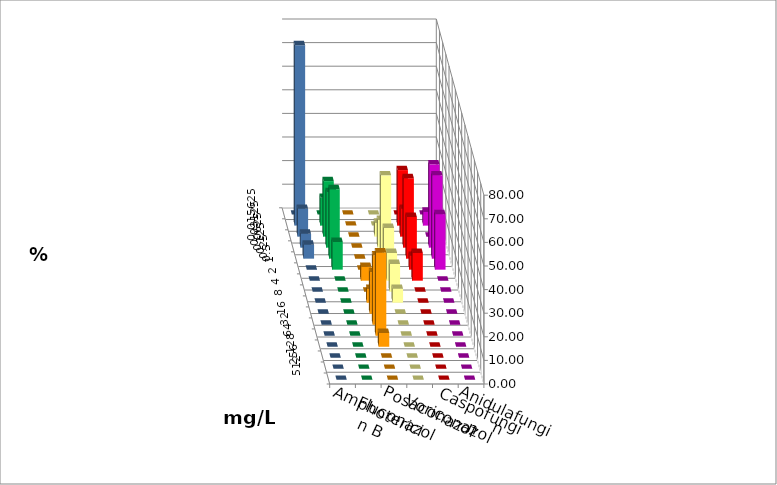
| Category | Amphotericin B | Fluconazol | Posaconazol | Voriconazol | Caspofungin | Anidulafungin |
|---|---|---|---|---|---|---|
| 0.015625 | 0 | 0 | 0 | 0 | 0 | 0 |
| 0.03125 | 11.765 | 0 | 0 | 23.529 | 5.882 | 76.471 |
| 0.0625 | 23.529 | 0 | 5.882 | 11.765 | 0 | 11.765 |
| 0.125 | 23.529 | 0 | 11.765 | 29.412 | 35.294 | 5.882 |
| 0.25 | 29.412 | 0 | 35.294 | 17.647 | 35.294 | 5.882 |
| 0.5 | 11.765 | 0 | 17.647 | 5.882 | 23.529 | 0 |
| 1.0 | 0 | 5.882 | 11.765 | 11.765 | 0 | 0 |
| 2.0 | 0 | 0 | 11.765 | 0 | 0 | 0 |
| 4.0 | 0 | 5.882 | 5.882 | 0 | 0 | 0 |
| 8.0 | 0 | 17.647 | 0 | 0 | 0 | 0 |
| 16.0 | 0 | 29.412 | 0 | 0 | 0 | 0 |
| 32.0 | 0 | 35.294 | 0 | 0 | 0 | 0 |
| 64.0 | 0 | 5.882 | 0 | 0 | 0 | 0 |
| 128.0 | 0 | 0 | 0 | 0 | 0 | 0 |
| 256.0 | 0 | 0 | 0 | 0 | 0 | 0 |
| 512.0 | 0 | 0 | 0 | 0 | 0 | 0 |